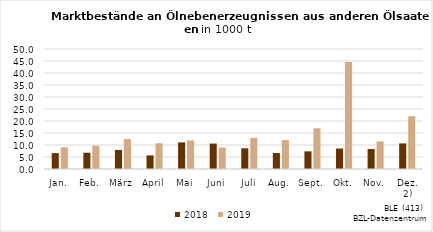
| Category | 2018 | 2019 |
|---|---|---|
| Jan. | 6.621 | 9.067 |
| Feb. | 6.786 | 9.733 |
| März | 7.922 | 12.472 |
| April | 5.671 | 10.73 |
| Mai | 11.092 | 11.932 |
| Juni | 10.6 | 8.936 |
| Juli | 8.626 | 12.969 |
| Aug. | 6.651 | 12.058 |
| Sept. | 7.341 | 16.967 |
| Okt. | 8.512 | 44.567 |
| Nov. | 8.312 | 11.517 |
| Dez. 2) | 10.663 | 21.991 |